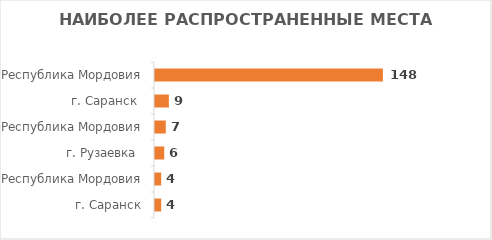
| Category | Итог |
|---|---|
| Республика Мордовия, г. Саранск  | 148 |
| Республика Мордовия, г. Рузаевка  | 9 |
| Республика Мордовия, г. Саранск | 7 |
| Республика Мордовия, с. Белозерье  | 6 |
| Республика Мордовия, рп. Ялга  | 4 |
| Республика Мордовия, г. Инсар  | 4 |